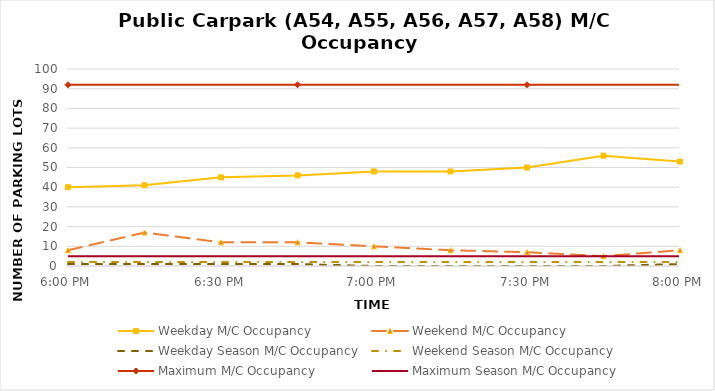
| Category | Weekday M/C Occupancy | Weekend M/C Occupancy | Weekday Season M/C Occupancy | Weekend Season M/C Occupancy | Maximum M/C Occupancy | Maximum Season M/C Occupancy |
|---|---|---|---|---|---|---|
| 0.75 | 40 | 8 | 1 | 2 | 92 | 5 |
| 0.760416666666667 | 41 | 17 | 1 | 2 | 92 | 5 |
| 0.770833333333333 | 45 | 12 | 1 | 2 | 92 | 5 |
| 0.78125 | 46 | 12 | 1 | 2 | 92 | 5 |
| 0.791666666666667 | 48 | 10 | 0 | 2 | 92 | 5 |
| 0.802083333333333 | 48 | 8 | 0 | 2 | 92 | 5 |
| 0.8125 | 50 | 7 | 0 | 2 | 92 | 5 |
| 0.822916666666667 | 56 | 5 | 0 | 2 | 92 | 5 |
| 0.833333333333333 | 53 | 8 | 1 | 2 | 92 | 5 |